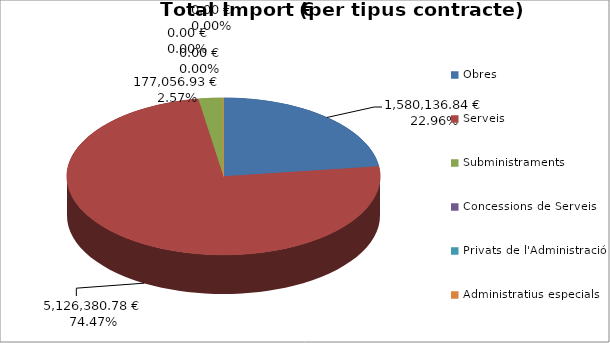
| Category | Total preu              (amb iva) |
|---|---|
| Obres | 1580136.84 |
| Serveis | 5126380.78 |
| Subministraments | 177056.93 |
| Concessions de Serveis | 0 |
| Privats de l'Administració | 0 |
| Administratius especials | 0 |